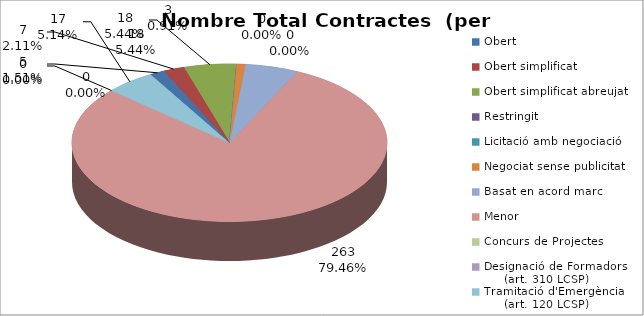
| Category | Nombre Total Contractes |
|---|---|
| Obert | 5 |
| Obert simplificat | 7 |
| Obert simplificat abreujat | 18 |
| Restringit | 0 |
| Licitació amb negociació | 0 |
| Negociat sense publicitat | 3 |
| Basat en acord marc | 18 |
| Menor | 263 |
| Concurs de Projectes | 0 |
| Designació de Formadors
     (art. 310 LCSP) | 0 |
| Tramitació d'Emergència
     (art. 120 LCSP) | 17 |